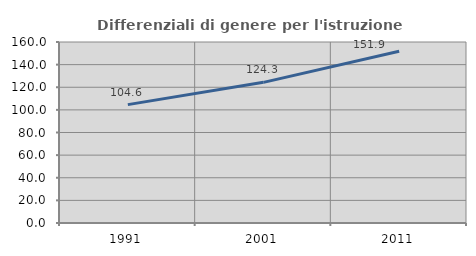
| Category | Differenziali di genere per l'istruzione superiore |
|---|---|
| 1991.0 | 104.624 |
| 2001.0 | 124.336 |
| 2011.0 | 151.888 |